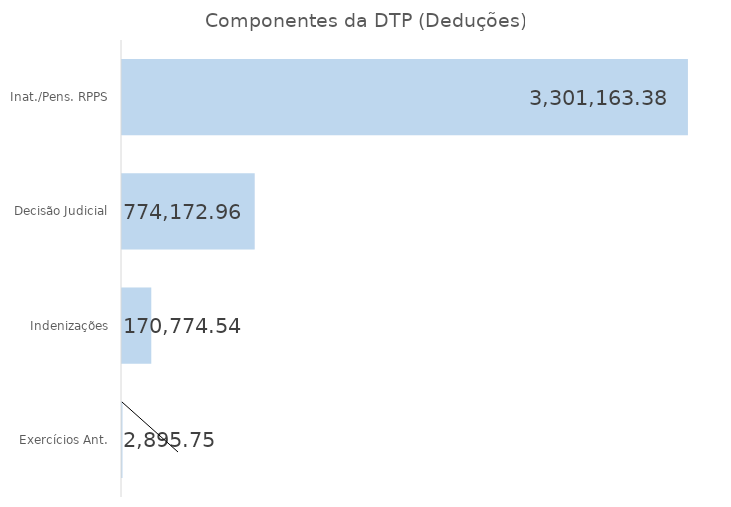
| Category | Series 0 |
|---|---|
| Inat./Pens. RPPS | 3301163.38 |
| Decisão Judicial | 774172.96 |
| Indenizações | 170774.54 |
| Exercícios Ant. | 2895.75 |